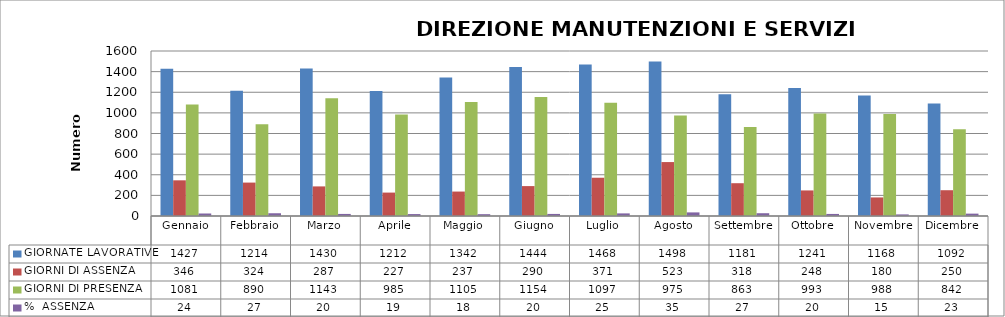
| Category | GIORNATE LAVORATIVE | GIORNI DI ASSENZA | GIORNI DI PRESENZA | %  ASSENZA |
|---|---|---|---|---|
| Gennaio | 1427 | 346 | 1081 | 24.247 |
| Febbraio | 1214 | 324 | 890 | 26.689 |
| Marzo | 1430 | 287 | 1143 | 20.07 |
| Aprile | 1212 | 227 | 985 | 18.729 |
| Maggio | 1342 | 237 | 1105 | 17.66 |
| Giugno | 1444 | 290 | 1154 | 20.083 |
| Luglio | 1468 | 371 | 1097 | 25.272 |
| Agosto | 1498 | 523 | 975 | 34.913 |
| Settembre | 1181 | 318 | 863 | 26.926 |
| Ottobre | 1241 | 248 | 993 | 19.984 |
| Novembre | 1168 | 180 | 988 | 15.411 |
| Dicembre | 1092 | 250 | 842 | 22.894 |